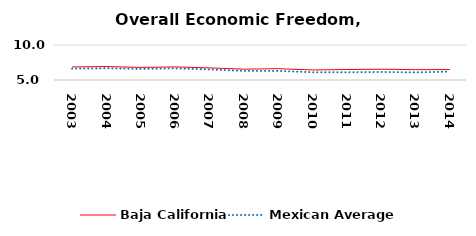
| Category | Baja California | Mexican Average  |
|---|---|---|
| 2003.0 | 6.865 | 6.632 |
| 2004.0 | 6.921 | 6.678 |
| 2005.0 | 6.798 | 6.582 |
| 2006.0 | 6.871 | 6.668 |
| 2007.0 | 6.73 | 6.508 |
| 2008.0 | 6.55 | 6.3 |
| 2009.0 | 6.619 | 6.3 |
| 2010.0 | 6.435 | 6.105 |
| 2011.0 | 6.499 | 6.103 |
| 2012.0 | 6.536 | 6.144 |
| 2013.0 | 6.479 | 6.087 |
| 2014.0 | 6.49 | 6.195 |